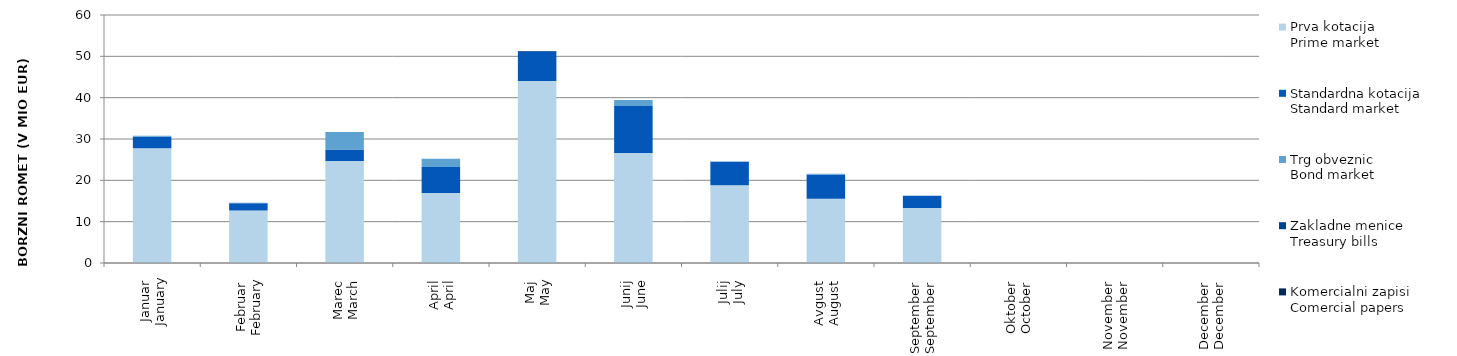
| Category | Prva kotacija
Prime market | Standardna kotacija
Standard market | Trg obveznic
Bond market | Zakladne menice
Treasury bills | Komercialni zapisi
Comercial papers |
|---|---|---|---|---|---|
| Januar
January | 27.745 | 2.796 | 0.249 | 0 | 0 |
| Februar
February | 12.685 | 1.784 | 0.118 | 0 | 0 |
| Marec
March | 24.676 | 2.813 | 4.174 | 0 | 0 |
| April
April | 16.942 | 6.272 | 2.01 | 0 | 0 |
| Maj
May | 44.02 | 7.1 | 0 | 0.145 | 0 |
| Junij
June | 26.612 | 11.39 | 1.425 | 0 | 0 |
| Julij
July | 18.826 | 5.646 | 0.075 | 0 | 0 |
| Avgust
August | 15.523 | 5.813 | 0.265 | 0 | 0 |
| September
September | 13.292 | 2.966 | 0.029 | 0 | 0 |
| Oktober
October | 0 | 0 | 0 | 0 | 0 |
| November
November | 0 | 0 | 0 | 0 | 0 |
| December
December | 0 | 0 | 0 | 0 | 0 |